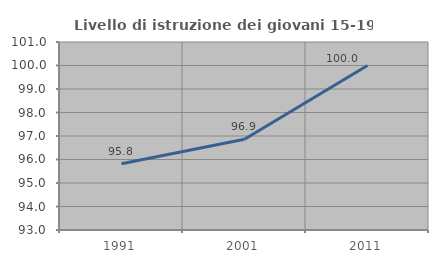
| Category | Livello di istruzione dei giovani 15-19 anni |
|---|---|
| 1991.0 | 95.816 |
| 2001.0 | 96.861 |
| 2011.0 | 100 |